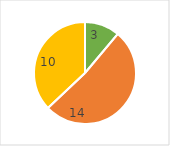
| Category | Series 0 |
|---|---|
| Demand focus | 3 |
| Supply focus | 14 |
| Maybe/unsure | 10 |